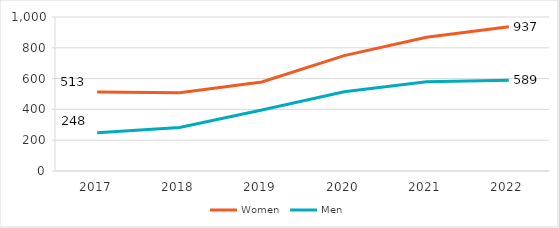
| Category | Women | Men |
|---|---|---|
| 2017.0 | 512.833 | 248 |
| 2018.0 | 508.333 | 282.25 |
| 2019.0 | 577.75 | 396.083 |
| 2020.0 | 749 | 515 |
| 2021.0 | 869 | 579 |
| 2022.0 | 937 | 589 |